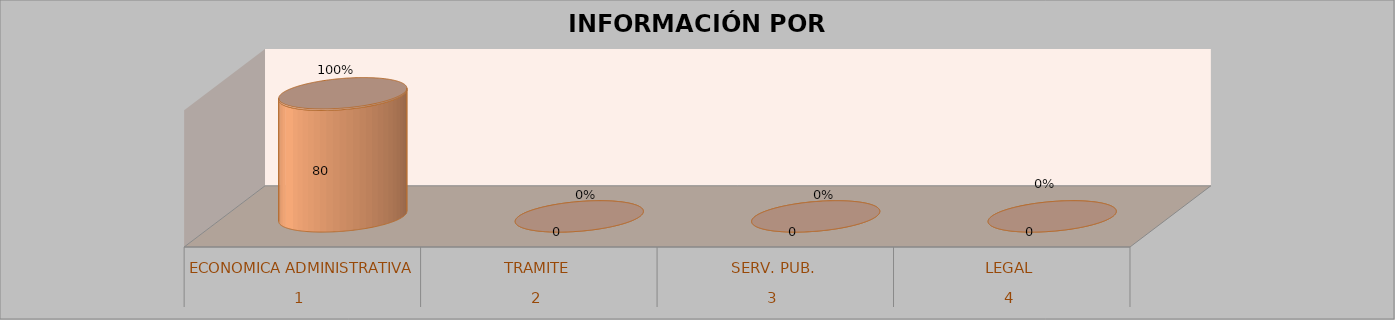
| Category | Series 0 | Series 1 | Series 2 | Series 3 |
|---|---|---|---|---|
| 0 |  |  | 80 | 1 |
| 1 |  |  | 0 | 0 |
| 2 |  |  | 0 | 0 |
| 3 |  |  | 0 | 0 |